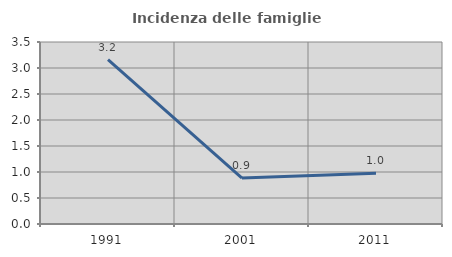
| Category | Incidenza delle famiglie numerose |
|---|---|
| 1991.0 | 3.161 |
| 2001.0 | 0.883 |
| 2011.0 | 0.977 |